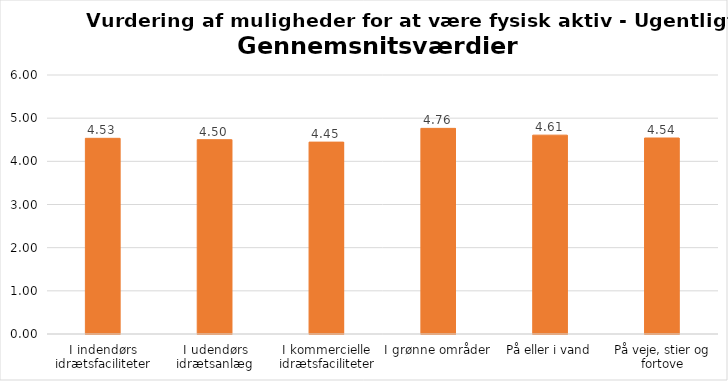
| Category | Gennemsnit |
|---|---|
| I indendørs idrætsfaciliteter | 4.533 |
| I udendørs idrætsanlæg | 4.501 |
| I kommercielle idrætsfaciliteter | 4.445 |
| I grønne områder | 4.764 |
| På eller i vand | 4.607 |
| På veje, stier og fortove | 4.54 |